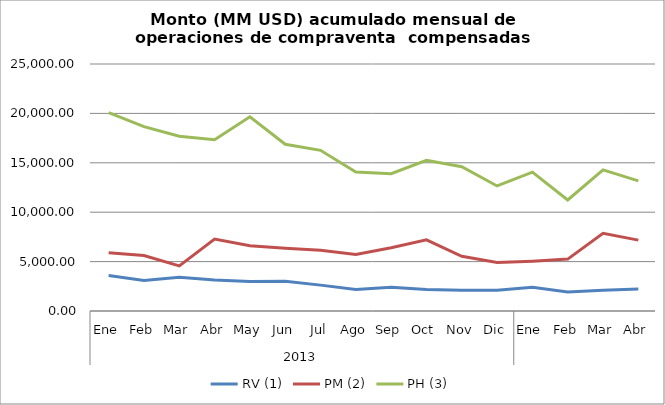
| Category | RV (1) | PM (2) | PH (3) |
|---|---|---|---|
| 0 | 3582.113 | 5901.651 | 20087.034 |
| 1 | 3086.223 | 5614.086 | 18662.914 |
| 2 | 3427.503 | 4559.027 | 17696.541 |
| 3 | 3146.302 | 7279.906 | 17332.385 |
| 4 | 2992.826 | 6596.857 | 19663.42 |
| 5 | 3012.804 | 6346.526 | 16878.408 |
| 6 | 2618.878 | 6139.885 | 16263.385 |
| 7 | 2182.732 | 5724.829 | 14069.305 |
| 8 | 2409.674 | 6399.577 | 13889.23 |
| 9 | 2180.079 | 7195.606 | 15254.774 |
| 10 | 2095.442 | 5541.836 | 14598.61 |
| 11 | 2104.88 | 4905.995 | 12657.524 |
| 12 | 2410.581 | 5047.1 | 14052.921 |
| 13 | 1913.3 | 5251.955 | 11240.27 |
| 14 | 2111.981 | 7861.413 | 14290.324 |
| 15 | 2223.473 | 7175.644 | 13176.799 |